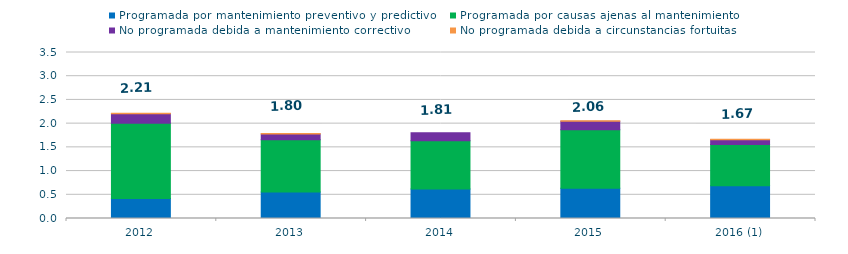
| Category | Programada por mantenimiento preventivo y predictivo | Programada por causas ajenas al mantenimiento  | No programada debida a mantenimiento correctivo  | No programada debida a circunstancias fortuitas  |
|---|---|---|---|---|
| 2012 | 0.42 | 1.59 | 0.2 | 0.01 |
| 2013 | 0.56 | 1.1 | 0.12 | 0.01 |
| 2014 | 0.62 | 1.02 | 0.17 | 0 |
| 2015 | 0.64 | 1.23 | 0.18 | 0.01 |
| 2016 (1) | 0.69 | 0.87 | 0.1 | 0.01 |